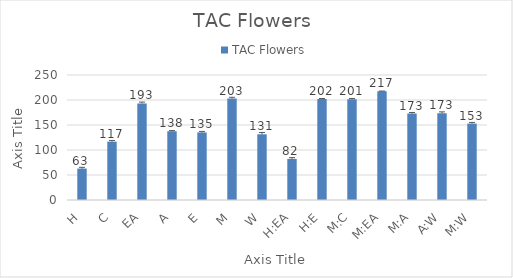
| Category | TAC Flowers  |
|---|---|
| H | 62.9 |
| C | 116.736 |
| EA | 193.145 |
| A | 137.556 |
| E | 135.151 |
| M | 202.902 |
| W | 131.435 |
| H:EA | 82.231 |
| H:E | 201.944 |
| M:C | 201.35 |
| M:EA | 217.412 |
| M:A | 172.81 |
| A:W | 173.406 |
| M:W | 152.849 |